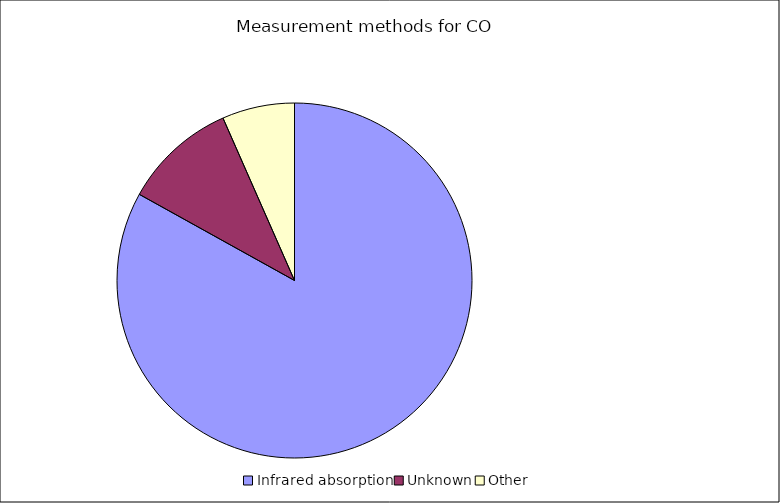
| Category | Series 0 |
|---|---|
| Infrared absorption | 83.065 |
| Unknown | 10.334 |
| Other | 6.601 |